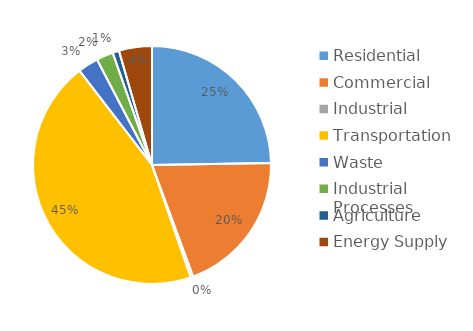
| Category | Series 0 |
|---|---|
| Residential | 581482.09 |
| Commercial | 461237.599 |
| Industrial | 8069.164 |
| Transportation | 1053463.149 |
| Waste | 65482.574 |
| Industrial Processes | 53776.294 |
| Agriculture | 20706.762 |
| Energy Supply | 105348.22 |